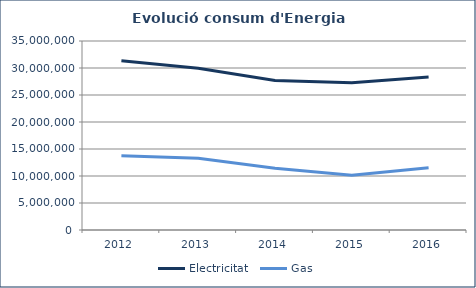
| Category | Electricitat  | Gas |
|---|---|---|
| 2012.0 | 31354841 | 13753576 |
| 2013.0 | 29958213.969 | 13282642 |
| 2014.0 | 27682421.658 | 11441025 |
| 2015.0 | 27258177 | 10127600 |
| 2016.0 | 28355373 | 11526388 |